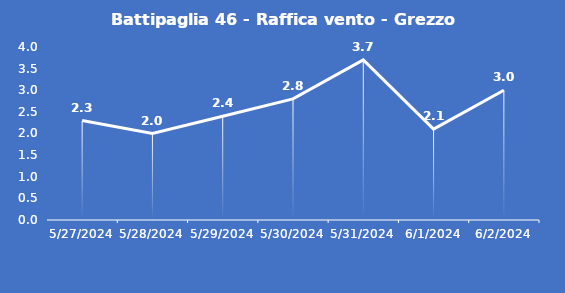
| Category | Battipaglia 46 - Raffica vento - Grezzo (m/s) |
|---|---|
| 5/27/24 | 2.3 |
| 5/28/24 | 2 |
| 5/29/24 | 2.4 |
| 5/30/24 | 2.8 |
| 5/31/24 | 3.7 |
| 6/1/24 | 2.1 |
| 6/2/24 | 3 |